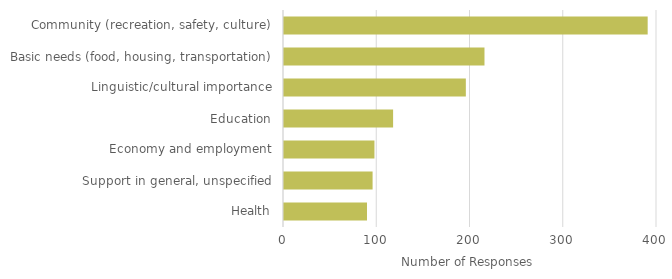
| Category | Series 0 |
|---|---|
| Health | 89 |
| Support in general, unspecified | 95 |
| Economy and employment | 97 |
| Education | 117 |
| Linguistic/cultural importance | 195 |
| Basic needs (food, housing, transportation) | 215 |
| Community (recreation, safety, culture) | 390 |